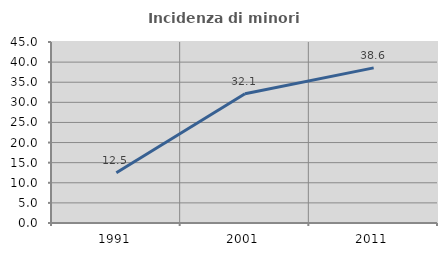
| Category | Incidenza di minori stranieri |
|---|---|
| 1991.0 | 12.5 |
| 2001.0 | 32.143 |
| 2011.0 | 38.571 |